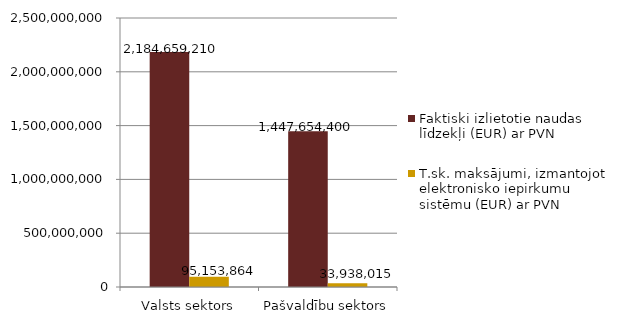
| Category | Faktiski izlietotie naudas līdzekļi (EUR) ar PVN | T.sk. maksājumi, izmantojot elektronisko iepirkumu sistēmu (EUR) ar PVN |
|---|---|---|
| Valsts sektors | 2184659210 | 95153864 |
| Pašvaldību sektors | 1447654400 | 33938015 |